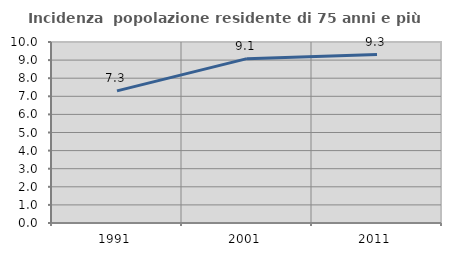
| Category | Incidenza  popolazione residente di 75 anni e più |
|---|---|
| 1991.0 | 7.3 |
| 2001.0 | 9.081 |
| 2011.0 | 9.308 |